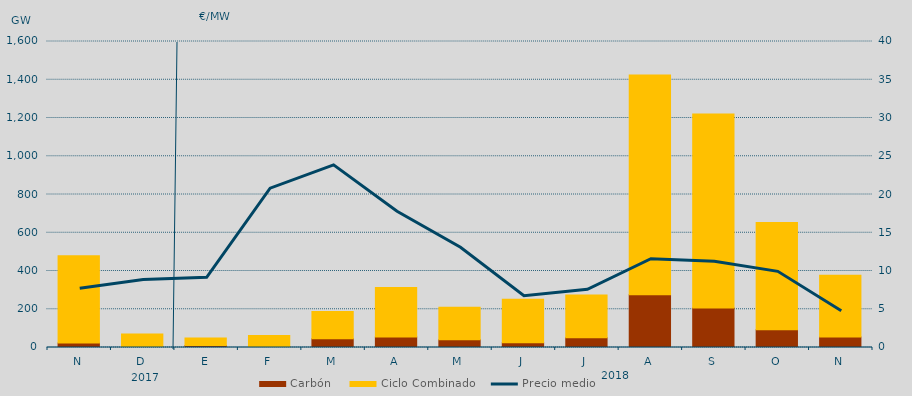
| Category | Carbón | Ciclo Combinado |
|---|---|---|
| N | 23926.9 | 455734.5 |
| D | 3200.6 | 67420.5 |
| E | 10696.2 | 39454.7 |
| F | 4341.9 | 58215.4 |
| M | 45246.3 | 142680.5 |
| A | 55123 | 258682.2 |
| M | 40054.5 | 170347.3 |
| J | 24939.8 | 227127.5 |
| J | 50362.4 | 224750.8 |
| A | 276044.1 | 1148967.5 |
| S | 206113.1 | 1015257.7 |
| O | 93052.3 | 560872.2 |
| N | 55331.6 | 322094.1 |